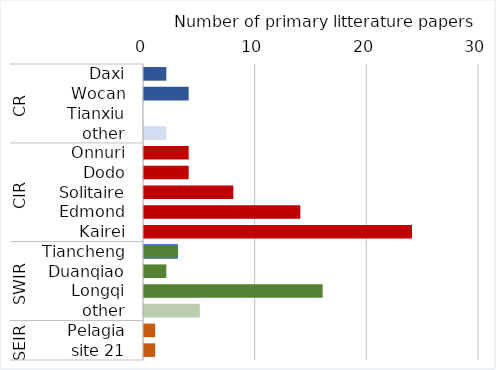
| Category | Series 0 |
|---|---|
| 0 | 2 |
| 1 | 4 |
| 2 | 0 |
| 3 | 2 |
| 4 | 4 |
| 5 | 4 |
| 6 | 8 |
| 7 | 14 |
| 8 | 24 |
| 9 | 3 |
| 10 | 2 |
| 11 | 16 |
| 12 | 5 |
| 13 | 1 |
| 14 | 1 |